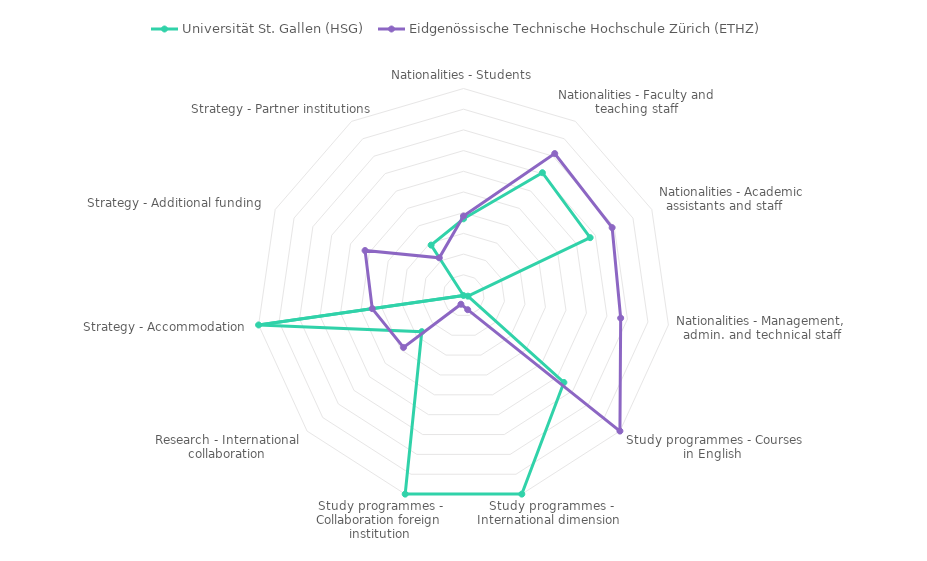
| Category | Universität St. Gallen (HSG) | Eidgenössische Technische Hochschule Zürich (ETHZ) |
|---|---|---|
| Nationalities - Students | 0.371 | 0.384 |
| Nationalities - Faculty and teaching staff | 0.705 | 0.815 |
| Nationalities - Academic assistants and staff     | 0.673 | 0.789 |
| Nationalities - Management, admin. and technical staff | 0.021 | 0.767 |
| Study programmes - Courses in English  | 0.642 | 1 |
| Study programmes - International dimension  | 1 | 0.071 |
| Study programmes - Collaboration foreign institution | 1 | 0.044 |
| Research - International collaboration | 0.267 | 0.383 |
| Strategy - Accommodation  | 1 | 0.445 |
| Strategy - Additional funding  | 0 | 0.523 |
| Strategy - Partner institutions  | 0.289 | 0.216 |